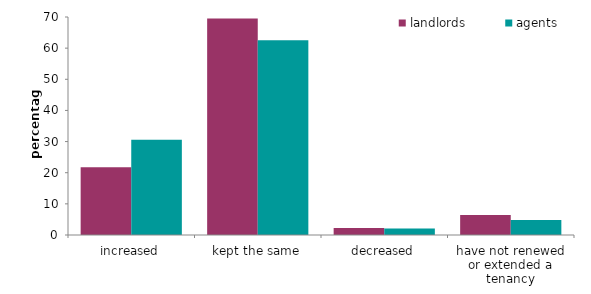
| Category | landlords | agents |
|---|---|---|
| increased | 21.79 | 30.577 |
| kept the same | 69.556 | 62.521 |
| decreased | 2.212 | 2.067 |
| have not renewed or extended a tenancy | 6.442 | 4.835 |